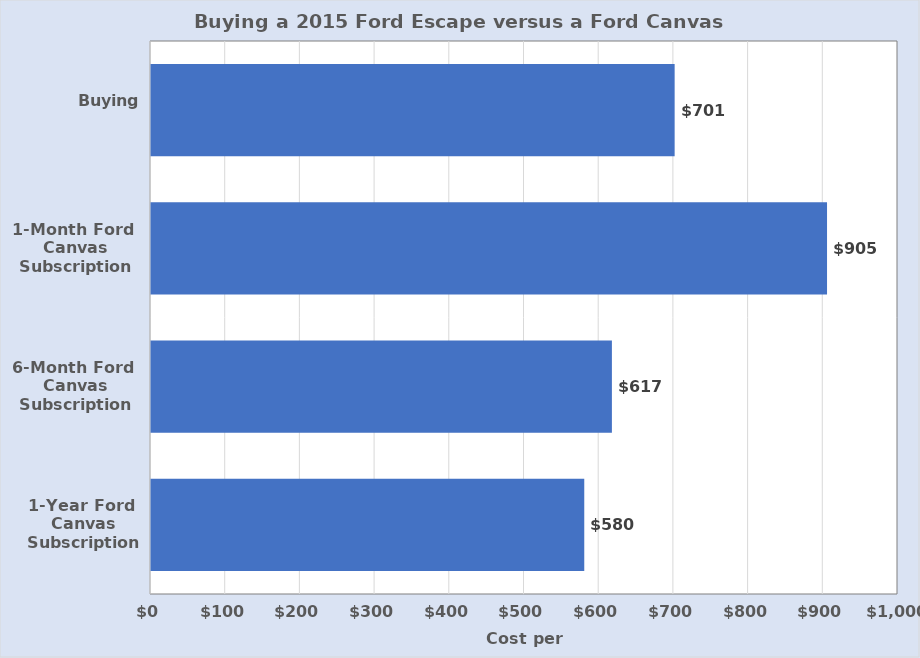
| Category | Cost per Month (Dollars) |
|---|---|
| 1-Year Ford 
Canvas Subscription | 580 |
| 6-Month Ford 
Canvas Subscription | 617 |
| 1-Month Ford 
Canvas Subscription | 905 |
| Buying | 701 |